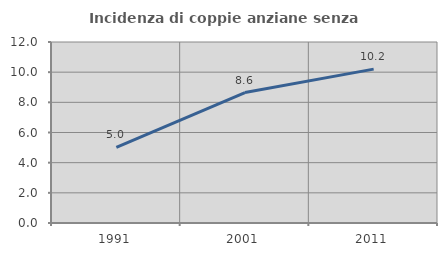
| Category | Incidenza di coppie anziane senza figli  |
|---|---|
| 1991.0 | 5.011 |
| 2001.0 | 8.647 |
| 2011.0 | 10.202 |